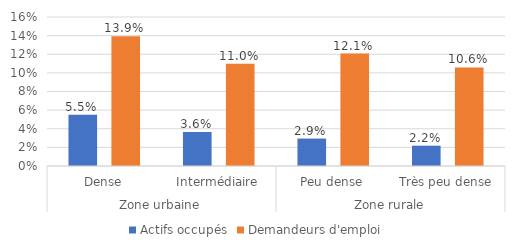
| Category | Actifs occupés | Demandeurs d'emploi |
|---|---|---|
| 0 | 0.055 | 0.139 |
| 1 | 0.036 | 0.11 |
| 2 | 0.029 | 0.121 |
| 3 | 0.022 | 0.106 |